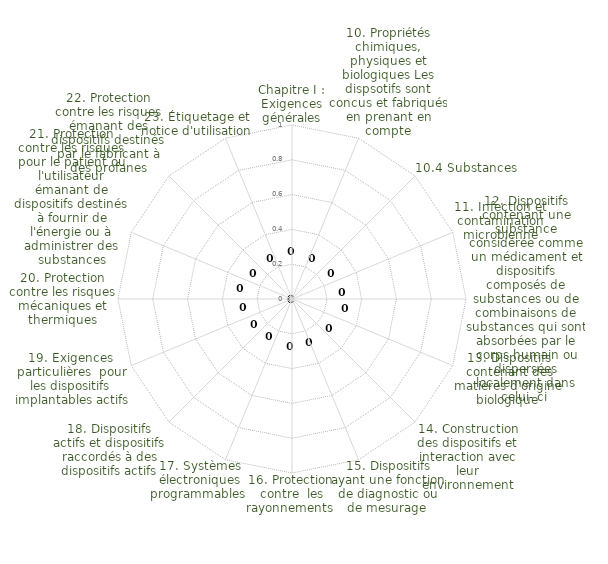
| Category | Series 0 | Series 1 | Series 2 | Series 3 | Series 4 |
|---|---|---|---|---|---|
| Chapitre I : Exigences générales |  |  |  |  | 0 |
| 10. Propriétés chimiques, physiques et biologiques Les dispsotifs sont concus et fabriqués en prenant en compte |  |  |  |  | 0 |
| 10.4 Substances |  |  |  |  | 0 |
| 11. Infection et contamination microbienne |  |  |  |  | 0 |
| 12. Dispositifs contenant une substance considérée comme un médicament et dispositifs composés de substances ou de combinaisons de substances qui sont absorbées par le corps humain ou dispersées localement dans celui- ci  |  |  |  |  | 0 |
| 13. Dispositifs contenant des matières d'origine biologique  |  |  |  |  | 0 |
| 14. Construction des dispositifs et interaction avec leur environnement |  |  |  |  | 0 |
| 15. Dispositifs ayant une fonction de diagnostic ou de mesurage  |  |  |  |  | 0 |
| 16. Protection  contre  les rayonnements  |  |  |  |  | 0 |
| 17. Systèmes électroniques programmables  |  |  |  |  | 0 |
| 18. Dispositifs actifs et dispositifs raccordés à des dispositifs actifs |  |  |  |  | 0 |
| 19. Exigences  particulières  pour les dispositifs  implantables actifs |  |  |  |  | 0 |
| 20. Protection contre les risques mécaniques et thermiques |  |  |  |  | 0 |
| 21. Protection contre les risques pour le patient ou l'utilisateur émanant de dispositifs destinés à fournir de l'énergie ou à administrer des substances |  |  |  |  | 0 |
| 22. Protection contre les risques émanant des dispositifs destinés par le fabricant à des profanes |  |  |  |  | 0 |
| 23. Étiquetage et notice d'utilisation |  |  |  |  | 0 |